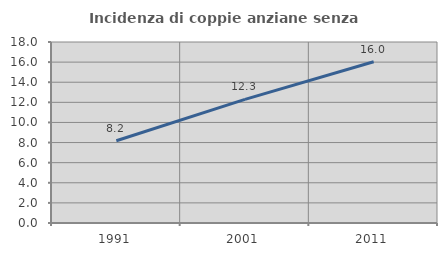
| Category | Incidenza di coppie anziane senza figli  |
|---|---|
| 1991.0 | 8.182 |
| 2001.0 | 12.297 |
| 2011.0 | 16.041 |